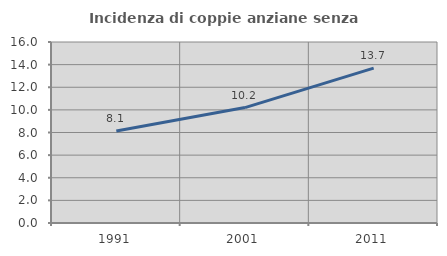
| Category | Incidenza di coppie anziane senza figli  |
|---|---|
| 1991.0 | 8.125 |
| 2001.0 | 10.204 |
| 2011.0 | 13.694 |